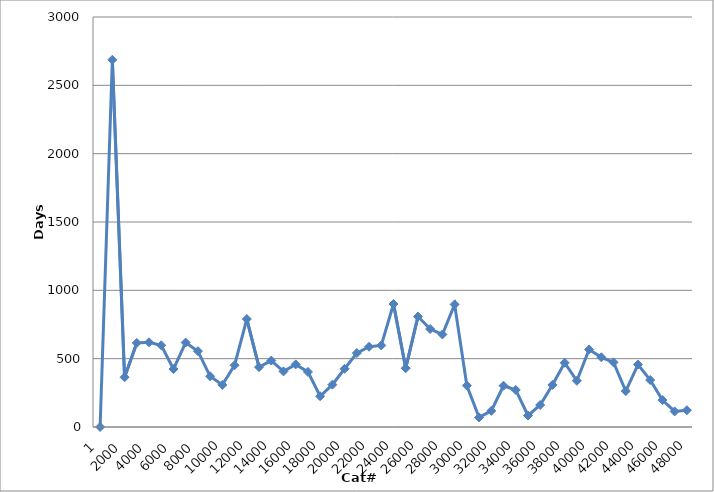
| Category | Cat# |
|---|---|
| 1.0 | 0 |
| 1000.0 | 2687 |
| 2000.0 | 364 |
| 3000.0 | 615 |
| 4000.0 | 620 |
| 5000.0 | 598 |
| 6000.0 | 424 |
| 7000.0 | 618 |
| 8000.0 | 555 |
| 9000.0 | 371 |
| 10000.0 | 308 |
| 11000.0 | 452 |
| 12000.0 | 790 |
| 13000.0 | 438 |
| 14000.0 | 486 |
| 15000.0 | 407 |
| 16000.0 | 458 |
| 17000.0 | 403 |
| 18000.0 | 225 |
| 19000.0 | 310 |
| 20000.0 | 426 |
| 21000.0 | 541 |
| 22000.0 | 587 |
| 23000.0 | 597 |
| 24000.0 | 900 |
| 25000.0 | 430 |
| 26000.0 | 808 |
| 27000.0 | 717 |
| 28000.0 | 677 |
| 29000.0 | 897 |
| 30000.0 | 303 |
| 31000.0 | 70 |
| 32000.0 | 118 |
| 33000.0 | 302 |
| 34000.0 | 271 |
| 35000.0 | 84 |
| 36000.0 | 161 |
| 37000.0 | 308 |
| 38000.0 | 470 |
| 39000.0 | 338 |
| 40000.0 | 567 |
| 41000.0 | 510 |
| 42000.0 | 473 |
| 43000.0 | 263 |
| 44000.0 | 457 |
| 45000.0 | 344 |
| 46000.0 | 197 |
| 47000.0 | 114 |
| 48000.0 | 123 |